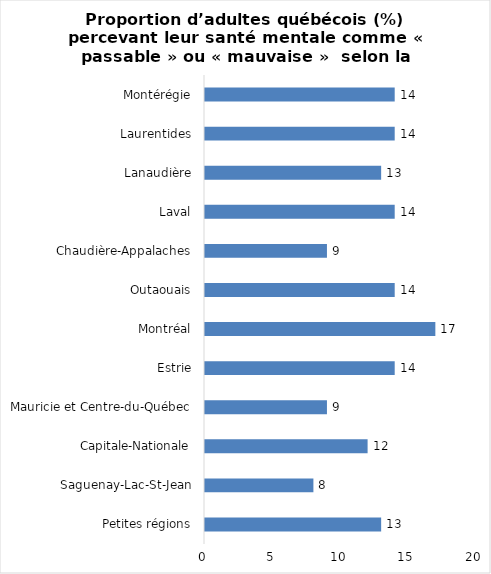
| Category | Series 0 |
|---|---|
| Petites régions | 13 |
| Saguenay-Lac-St-Jean | 8 |
| Capitale-Nationale | 12 |
| Mauricie et Centre-du-Québec | 9 |
| Estrie | 14 |
| Montréal | 17 |
| Outaouais | 14 |
| Chaudière-Appalaches | 9 |
| Laval | 14 |
| Lanaudière | 13 |
| Laurentides | 14 |
| Montérégie | 14 |